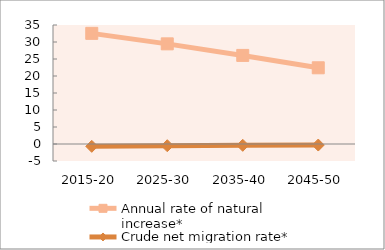
| Category | Annual rate of natural increase* | Crude net migration rate* |
|---|---|---|
| 2015-20 | 32.542 | -0.688 |
| 2025-30 | 29.455 | -0.508 |
| 2035-40 | 26.053 | -0.386 |
| 2045-50 | 22.416 | -0.304 |